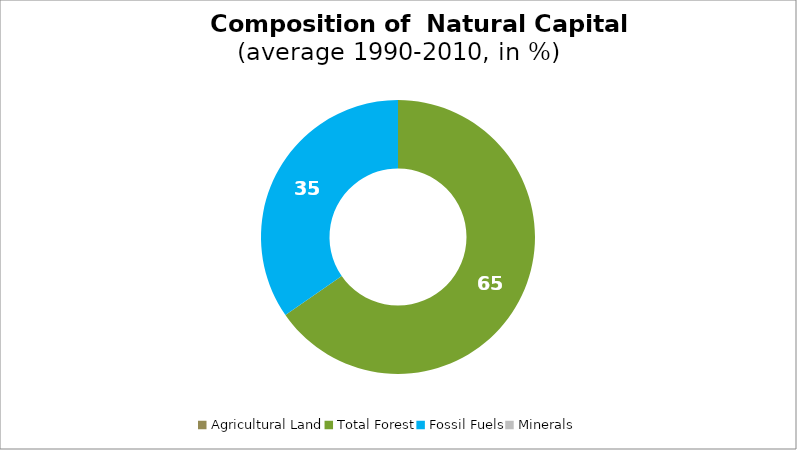
| Category | Series 0 |
|---|---|
| Agricultural Land | 0 |
| Total Forest | 65.352 |
| Fossil Fuels | 34.648 |
| Minerals | 0 |